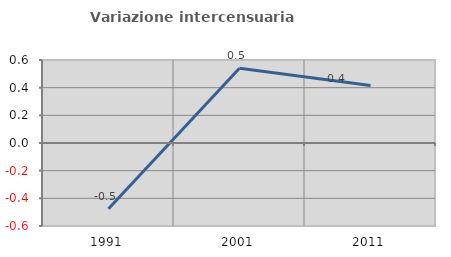
| Category | Variazione intercensuaria annua |
|---|---|
| 1991.0 | -0.475 |
| 2001.0 | 0.54 |
| 2011.0 | 0.416 |